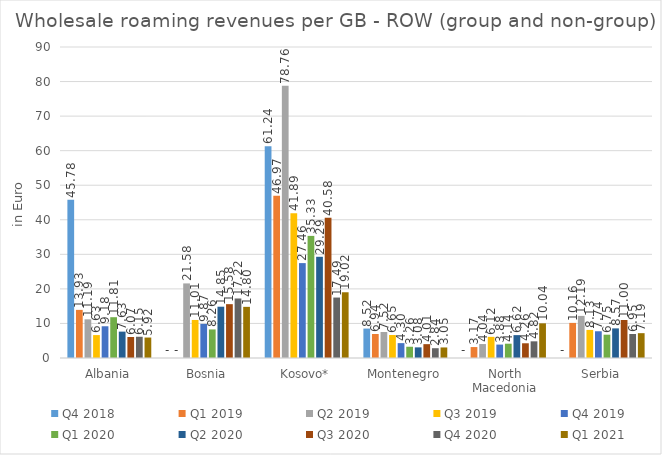
| Category | Q4 2018 | Q1 2019 | Q2 2019 | Q3 2019 | Q4 2019 | Q1 2020 | Q2 2020 | Q3 2020 | Q4 2020 | Q1 2021 |
|---|---|---|---|---|---|---|---|---|---|---|
| Albania | 45.775 | 13.925 | 11.189 | 6.632 | 9.182 | 11.806 | 7.633 | 6.074 | 6.149 | 5.92 |
| Bosnia | 0 | 0 | 21.583 | 11.008 | 9.872 | 8.264 | 14.846 | 15.579 | 17.224 | 14.801 |
| Kosovo* | 61.245 | 46.971 | 78.757 | 41.891 | 27.462 | 35.334 | 29.29 | 40.583 | 17.494 | 19.023 |
| Montenegro | 8.516 | 6.94 | 7.518 | 6.65 | 4.303 | 3.256 | 3.077 | 4.008 | 2.835 | 3.052 |
| North Macedonia | 0 | 3.168 | 4.039 | 6.123 | 3.883 | 4.137 | 6.62 | 4.26 | 4.825 | 10.036 |
| Serbia | 0 | 10.156 | 12.186 | 8.125 | 7.74 | 6.747 | 8.571 | 10.995 | 6.946 | 7.185 |